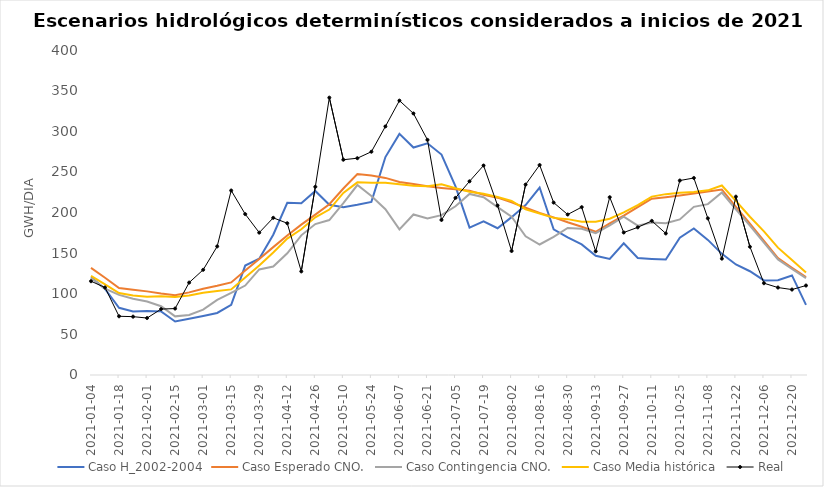
| Category | Caso H_2002-2004 | Caso Esperado CNO. | Caso Contingencia CNO. | Caso Media histórica | Real |
|---|---|---|---|---|---|
| 2021-01-04 | 120.403 | 131.856 | 119.414 | 121.867 | 115.426 |
| 2021-01-11 | 105.86 | 119.723 | 106.376 | 111.634 | 107.674 |
| 2021-01-18 | 82.704 | 107.133 | 98.591 | 100.823 | 72.274 |
| 2021-01-25 | 78.17 | 104.943 | 93.839 | 97.779 | 71.809 |
| 2021-02-01 | 78.826 | 102.927 | 90.524 | 96.274 | 70.103 |
| 2021-02-08 | 78.309 | 100.327 | 84.633 | 97.021 | 81.133 |
| 2021-02-15 | 65.841 | 98.229 | 72.193 | 95.947 | 81.777 |
| 2021-02-22 | 69.203 | 101.679 | 73.876 | 97.933 | 113.727 |
| 2021-03-01 | 72.734 | 106.149 | 80.429 | 101.197 | 129.464 |
| 2021-03-08 | 76.369 | 109.749 | 92.54 | 103.426 | 158.27 |
| 2021-03-15 | 86.47 | 113.939 | 101.054 | 105.357 | 227.06 |
| 2021-03-22 | 134.66 | 128.559 | 110.07 | 119.914 | 198.03 |
| 2021-03-29 | 143.143 | 142.77 | 129.973 | 134.813 | 175.207 |
| 2021-04-05 | 172.686 | 157.4 | 133.464 | 150.843 | 193.433 |
| 2021-04-12 | 212.029 | 171.6 | 149.786 | 167.943 | 186.767 |
| 2021-04-19 | 211.429 | 185.029 | 171.886 | 179.429 | 127.49 |
| 2021-04-26 | 226.557 | 197.443 | 185.743 | 194.029 | 231.631 |
| 2021-05-03 | 209.6 | 210.129 | 190.671 | 203.586 | 341.37 |
| 2021-05-10 | 206.571 | 229.586 | 211.557 | 224.1 | 264.947 |
| 2021-05-17 | 209.471 | 247.457 | 233.814 | 237.114 | 266.823 |
| 2021-05-24 | 213.071 | 245.429 | 220.357 | 236.643 | 274.803 |
| 2021-05-31 | 268.229 | 242.586 | 204.071 | 236.729 | 305.926 |
| 2021-06-07 | 296.786 | 237.629 | 179.186 | 234.871 | 337.71 |
| 2021-06-14 | 279.929 | 235.071 | 197.6 | 233.071 | 321.887 |
| 2021-06-21 | 285.157 | 232.329 | 192.529 | 232.343 | 289.397 |
| 2021-06-28 | 271.314 | 230.271 | 196.714 | 234.671 | 190.811 |
| 2021-07-05 | 232.114 | 228.514 | 207.714 | 229.843 | 218.004 |
| 2021-07-12 | 181.457 | 226.657 | 222.871 | 225.643 | 238.374 |
| 2021-07-19 | 189.186 | 221.743 | 218.786 | 223.086 | 257.829 |
| 2021-07-26 | 180.614 | 218.271 | 206.629 | 219.157 | 208.624 |
| 2021-08-02 | 194.3 | 212.443 | 194.871 | 214.243 | 152.586 |
| 2021-08-09 | 209.229 | 205.914 | 170.671 | 203.829 | 234.377 |
| 2021-08-16 | 230.757 | 199.486 | 160.629 | 198.857 | 258.427 |
| 2021-08-23 | 179.386 | 193.971 | 169.943 | 193.386 | 212.177 |
| 2021-08-30 | 169.371 | 187.929 | 181 | 191.829 | 197.534 |
| 2021-09-06 | 160.671 | 182.386 | 179.9 | 188.643 | 206.601 |
| 2021-09-13 | 146.657 | 176.3 | 174.629 | 188.643 | 152.221 |
| 2021-09-20 | 142.943 | 186.729 | 184.257 | 192.4 | 218.796 |
| 2021-09-27 | 162.057 | 196.186 | 194.829 | 200.257 | 175.384 |
| 2021-10-04 | 143.957 | 206.586 | 183.857 | 209 | 181.713 |
| 2021-10-11 | 142.9 | 217.014 | 187.771 | 219.529 | 189.686 |
| 2021-10-18 | 142.193 | 218.857 | 186.857 | 222.6 | 174.204 |
| 2021-10-25 | 168.971 | 220.9 | 191.514 | 224.229 | 239.343 |
| 2021-11-01 | 180.371 | 223.286 | 206.957 | 225.314 | 242.477 |
| 2021-11-08 | 166.3 | 225.8 | 210.314 | 227.271 | 192.781 |
| 2021-11-15 | 149.114 | 228.357 | 224.614 | 233.2 | 143.206 |
| 2021-11-22 | 136.011 | 206.886 | 203.829 | 214.314 | 219.48 |
| 2021-11-29 | 127.704 | 186.286 | 183.857 | 194.743 | 157.869 |
| 2021-12-06 | 116.407 | 164.971 | 162.786 | 176.857 | 112.979 |
| 2021-12-13 | 116.704 | 143.9 | 142.226 | 156.757 | 107.627 |
| 2021-12-20 | 122.53 | 131.977 | 130.484 | 141.4 | 105.157 |
| 2021-12-27 | 86.357 | 120.561 | 119.287 | 126.057 | 110.106 |